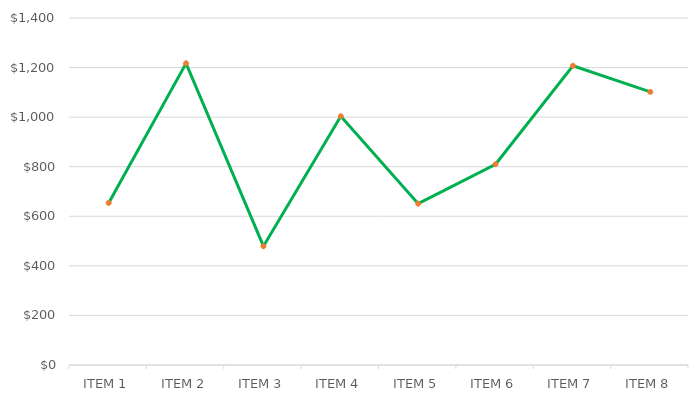
| Category | Series 1 |
|---|---|
| ITEM 1 | 653.975 |
| ITEM 2 | 1217.065 |
| ITEM 3 | 479.5 |
| ITEM 4 | 1003.75 |
| ITEM 5 | 651 |
| ITEM 6 | 810 |
| ITEM 7 | 1207.25 |
| ITEM 8 | 1101.76 |